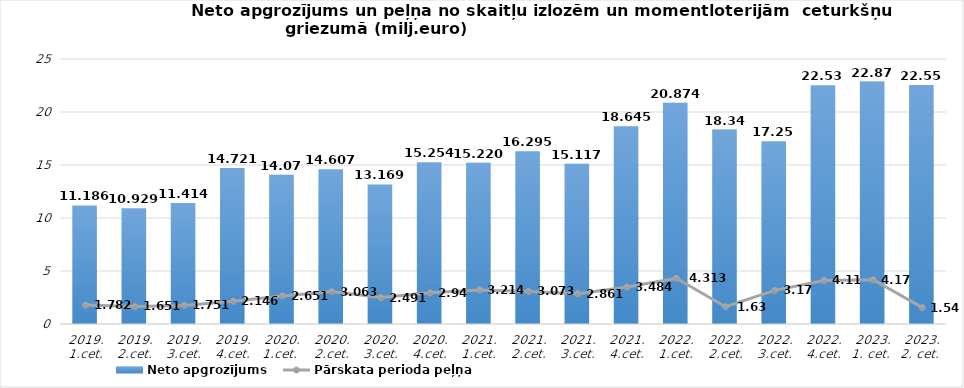
| Category | Neto apgrozījums |
|---|---|
| 2019. 1.cet. | 11.186 |
| 2019. 2.cet. | 10.929 |
| 2019. 3.cet. | 11.414 |
| 2019. 4.cet. | 14.721 |
| 2020. 1.cet.  | 14.07 |
| 2020. 2.cet. | 14.607 |
| 2020. 3.cet. | 13.169 |
| 2020. 4.cet. | 15.254 |
| 2021. 1.cet. | 15.22 |
| 2021. 2.cet. | 16.295 |
| 2021. 3.cet. | 15.117 |
| 2021. 4.cet. | 18.645 |
| 2022. 1.cet. | 20.874 |
| 2022. 2.cet. | 18.343 |
| 2022. 3.cet. | 17.251 |
| 2022. 4.cet. | 22.532 |
| 2023.
1. cet.  | 22.867 |
| 2023.
2. cet.  | 22.55 |